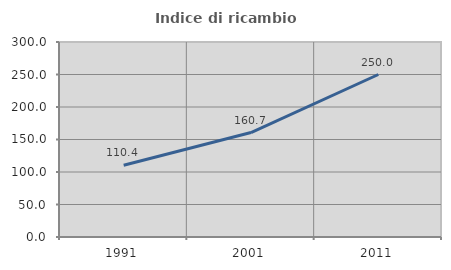
| Category | Indice di ricambio occupazionale  |
|---|---|
| 1991.0 | 110.4 |
| 2001.0 | 160.674 |
| 2011.0 | 250 |